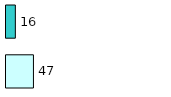
| Category | Series 0 | Series 1 |
|---|---|---|
| 0 | 47 | 16 |